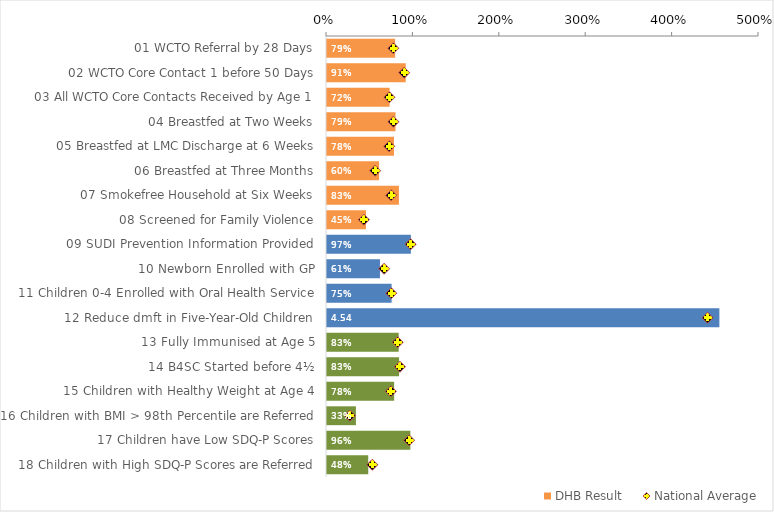
| Category | DHB Result |
|---|---|
| 01 WCTO Referral by 28 Days | 0.789 |
| 02 WCTO Core Contact 1 before 50 Days | 0.911 |
| 03 All WCTO Core Contacts Received by Age 1 | 0.724 |
| 04 Breastfed at Two Weeks | 0.793 |
| 05 Breastfed at LMC Discharge at 6 Weeks | 0.775 |
| 06 Breastfed at Three Months | 0.603 |
| 07 Smokefree Household at Six Weeks | 0.832 |
| 08 Screened for Family Violence | 0.451 |
| 09 SUDI Prevention Information Provided | 0.971 |
| 10 Newborn Enrolled with GP | 0.613 |
| 11 Children 0-4 Enrolled with Oral Health Service | 0.748 |
| 12 Reduce dmft in Five-Year-Old Children | 4.541 |
| 13 Fully Immunised at Age 5 | 0.83 |
| 14 B4SC Started before 4½ | 0.834 |
| 15 Children with Healthy Weight at Age 4 | 0.777 |
| 16 Children with BMI > 98th Percentile are Referred | 0.335 |
| 17 Children have Low SDQ-P Scores | 0.965 |
| 18 Children with High SDQ-P Scores are Referred | 0.477 |